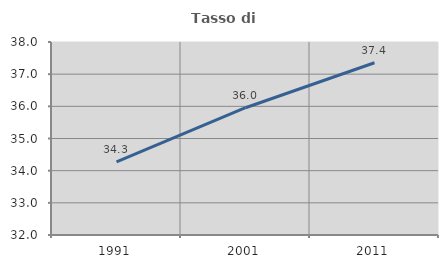
| Category | Tasso di occupazione   |
|---|---|
| 1991.0 | 34.27 |
| 2001.0 | 35.957 |
| 2011.0 | 37.356 |